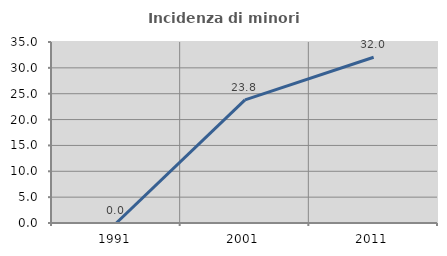
| Category | Incidenza di minori stranieri |
|---|---|
| 1991.0 | 0 |
| 2001.0 | 23.81 |
| 2011.0 | 32.047 |